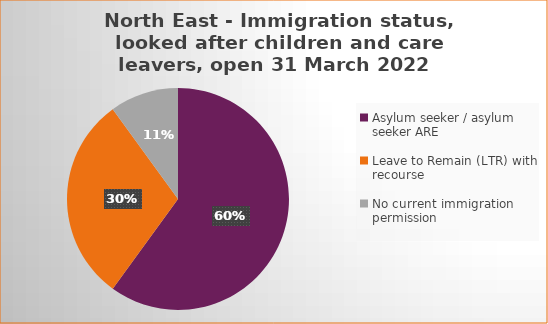
| Category | Number  | Percentage |
|---|---|---|
| Asylum seeker / asylum seeker ARE | 6 | 0.6 |
| Leave to Remain (LTR) with recourse | 3 | 0.3 |
| No current immigration permission | 1 | 0.1 |